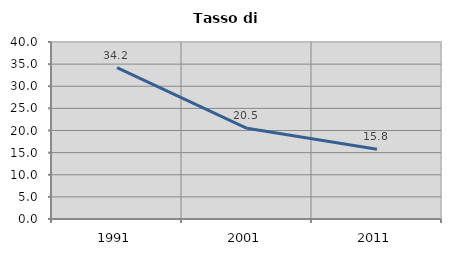
| Category | Tasso di disoccupazione   |
|---|---|
| 1991.0 | 34.191 |
| 2001.0 | 20.5 |
| 2011.0 | 15.77 |